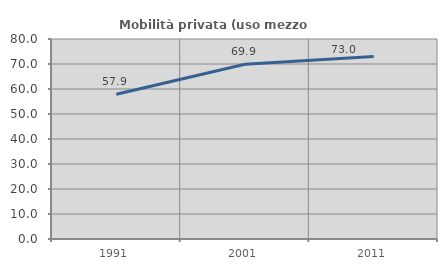
| Category | Mobilità privata (uso mezzo privato) |
|---|---|
| 1991.0 | 57.885 |
| 2001.0 | 69.886 |
| 2011.0 | 73.02 |